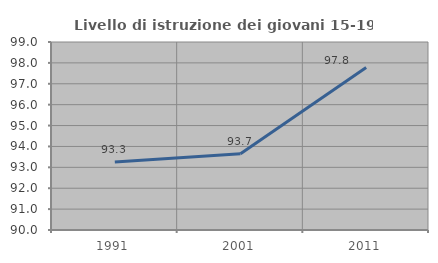
| Category | Livello di istruzione dei giovani 15-19 anni |
|---|---|
| 1991.0 | 93.258 |
| 2001.0 | 93.651 |
| 2011.0 | 97.778 |